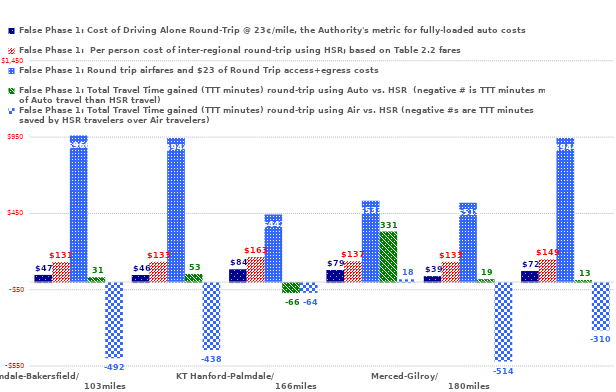
| Category | False Phase 1: Cost of Driving Alone Round-Trip @ 23¢/mile, the Authority's metric for fully-loaded auto costs | False Phase 1:  Per person cost of inter-regional round-trip using HSR; based on Table 2.2 fares | False Phase 1: Round trip airfares and $23 of Round Trip access+egress costs | False Phase 1: Total Travel Time gained (TTT minutes) round-trip using Auto vs. HSR  (negative # is TTT minutes more of Auto travel than HSR travel) | False Phase 1: Total Travel Time gained (TTT minutes) round-trip using Air vs. HSR (negative #s are TTT minutes saved by HSR travelers over Air travelers) |
|---|---|---|---|---|---|
| Palmdale-Bakersfield/                                                   103miles | 46.92 | 131 | 960 | 31.4 | -492 |
| Burbank (BUR)-Bakersfield/                                       154miles | 46.46 | 133 | 944 | 53.2 | -438 |
| KT Hanford-Palmdale/                                                 166miles | 83.72 | 163 | 442 | -65.8 | -64 |
| Fresno-Sacramento/                         172miles | 79.12 | 137 | 533 | 331.2 | 18 |
| Merced-Gilroy/                                               180miles | 38.64 | 133 | 519 | 18.7 | -514 |
| Bakersfield-Anaheim/                                             187miles | 72.22 | 149 | 944 | 13.3 | -310 |